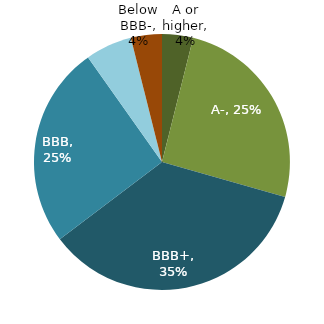
| Category | Series 0 |
|---|---|
| A or higher | 0.039 |
| A- | 0.255 |
| BBB+ | 0.353 |
| BBB | 0.255 |
| BBB- | 0.059 |
| Below BBB- | 0.039 |